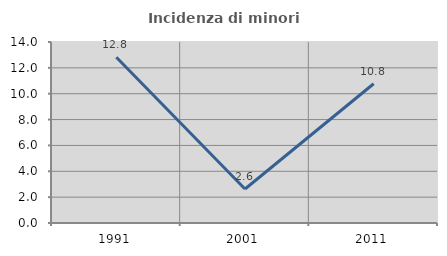
| Category | Incidenza di minori stranieri |
|---|---|
| 1991.0 | 12.821 |
| 2001.0 | 2.632 |
| 2011.0 | 10.769 |